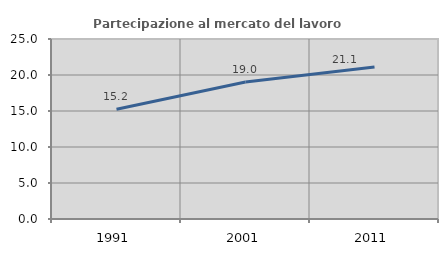
| Category | Partecipazione al mercato del lavoro  femminile |
|---|---|
| 1991.0 | 15.239 |
| 2001.0 | 19.016 |
| 2011.0 | 21.122 |